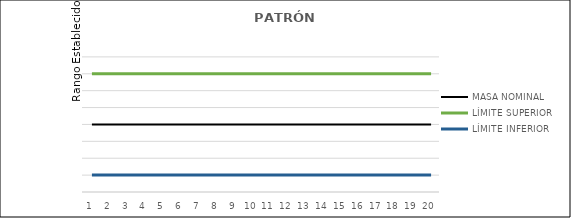
| Category | MASA NOMINAL | LÍMITE SUPERIOR | LÍMITE INFERIOR | Series 0 |
|---|---|---|---|---|
| 0 | 0.1 | 0.1 | 0.1 | 0.1 |
| 1 | 0.1 | 0.1 | 0.1 | 0.1 |
| 2 | 0.1 | 0.1 | 0.1 | 0.1 |
| 3 | 0.1 | 0.1 | 0.1 | 0.1 |
| 4 | 0.1 | 0.1 | 0.1 | 0.1 |
| 5 | 0.1 | 0.1 | 0.1 | 0.1 |
| 6 | 0.1 | 0.1 | 0.1 | 0.1 |
| 7 | 0.1 | 0.1 | 0.1 | 0.1 |
| 8 | 0.1 | 0.1 | 0.1 | 0.1 |
| 9 | 0.1 | 0.1 | 0.1 | 0.1 |
| 10 | 0.1 | 0.1 | 0.1 | 0.1 |
| 11 | 0.1 | 0.1 | 0.1 | 0.1 |
| 12 | 0.1 | 0.1 | 0.1 | 0.1 |
| 13 | 0.1 | 0.1 | 0.1 | 0.1 |
| 14 | 0.1 | 0.1 | 0.1 | 0.1 |
| 15 | 0.1 | 0.1 | 0.1 | 0.1 |
| 16 | 0.1 | 0.1 | 0.1 | 0.1 |
| 17 | 0.1 | 0.1 | 0.1 | 0.1 |
| 18 | 0.1 | 0.1 | 0.1 | 0.1 |
| 19 | 0.1 | 0.1 | 0.1 | 0.1 |